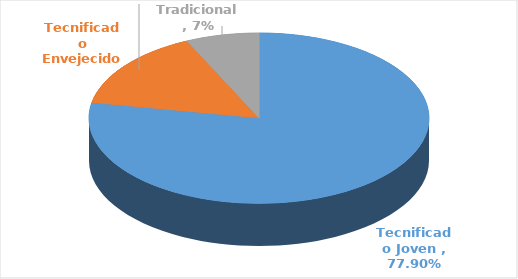
| Category | Porcentaje |
|---|---|
| Tecnificado Joven  | 0.779 |
| Tecnificado Envejecido | 0.151 |
| Tradicional | 0.07 |